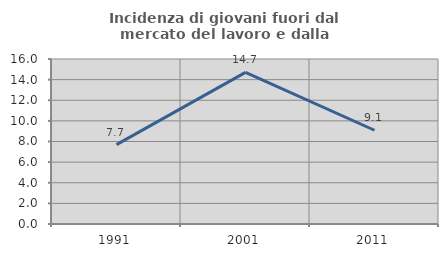
| Category | Incidenza di giovani fuori dal mercato del lavoro e dalla formazione  |
|---|---|
| 1991.0 | 7.692 |
| 2001.0 | 14.706 |
| 2011.0 | 9.091 |